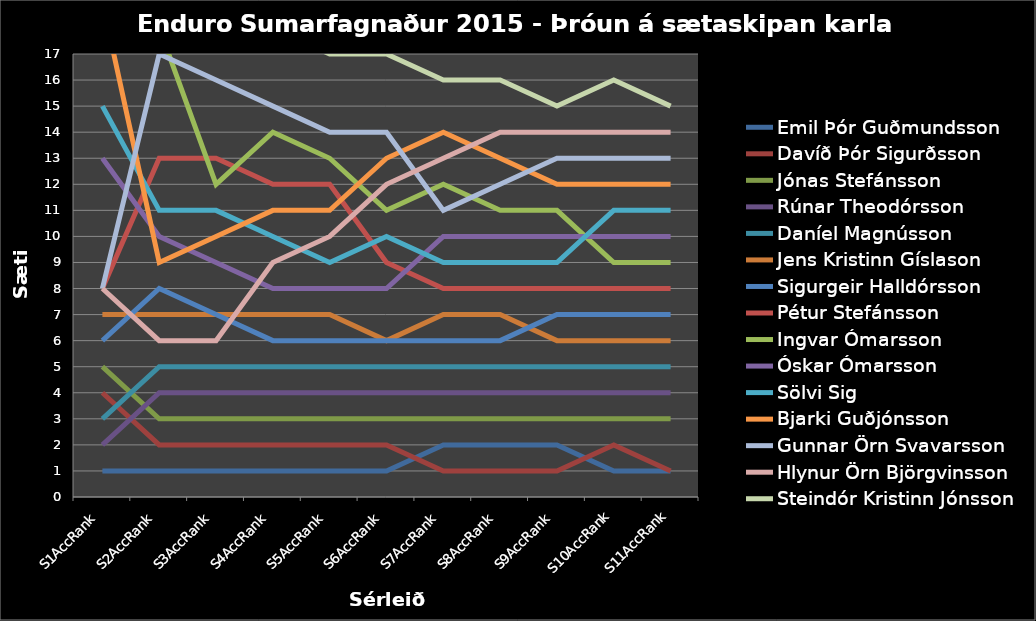
| Category | Emil Þór Guðmundsson  | Davíð Þór Sigurðsson  | Jónas Stefánsson  | Rúnar Theodórsson  | Daníel Magnússon  | Jens Kristinn Gíslason  | Sigurgeir Halldórsson  | Pétur Stefánsson  | Ingvar Ómarsson  | Óskar Ómarsson  | Sölvi Sig  | Bjarki Guðjónsson  | Gunnar Örn Svavarsson  | Hlynur Örn Björgvinsson  | Steindór Kristinn Jónsson  |
|---|---|---|---|---|---|---|---|---|---|---|---|---|---|---|---|
| S1AccRank | 1 | 4 | 5 | 2 | 3 | 7 | 6 | 8 | 24 | 13 | 15 | 19 | 8 | 8 | 18 |
| S2AccRank | 1 | 2 | 3 | 4 | 5 | 7 | 8 | 13 | 18 | 10 | 11 | 9 | 17 | 6 | 19 |
| S3AccRank | 1 | 2 | 3 | 4 | 5 | 7 | 7 | 13 | 12 | 9 | 11 | 10 | 16 | 6 | 18 |
| S4AccRank | 1 | 2 | 3 | 4 | 5 | 7 | 6 | 12 | 14 | 8 | 10 | 11 | 15 | 9 | 18 |
| S5AccRank | 1 | 2 | 3 | 4 | 5 | 7 | 6 | 12 | 13 | 8 | 9 | 11 | 14 | 10 | 17 |
| S6AccRank | 1 | 2 | 3 | 4 | 5 | 6 | 6 | 9 | 11 | 8 | 10 | 13 | 14 | 12 | 17 |
| S7AccRank | 2 | 1 | 3 | 4 | 5 | 7 | 6 | 8 | 12 | 10 | 9 | 14 | 11 | 13 | 16 |
| S8AccRank | 2 | 1 | 3 | 4 | 5 | 7 | 6 | 8 | 11 | 10 | 9 | 13 | 12 | 14 | 16 |
| S9AccRank | 2 | 1 | 3 | 4 | 5 | 6 | 7 | 8 | 11 | 10 | 9 | 12 | 13 | 14 | 15 |
| S10AccRank | 1 | 2 | 3 | 4 | 5 | 6 | 7 | 8 | 9 | 10 | 11 | 12 | 13 | 14 | 16 |
| S11AccRank | 1 | 1 | 3 | 4 | 5 | 6 | 7 | 8 | 9 | 10 | 11 | 12 | 13 | 14 | 15 |